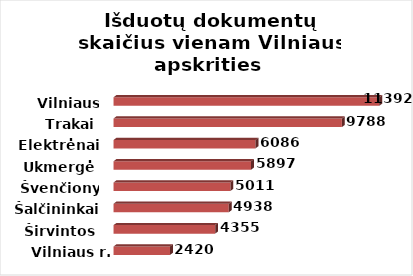
| Category | Series 0 |
|---|---|
| Vilniaus r. | 2420 |
| Širvintos | 4355 |
| Šalčininkai | 4938 |
| Švenčionys | 5011 |
| Ukmergė | 5897 |
| Elektrėnai | 6086 |
| Trakai | 9788 |
| Vilniaus m. | 11392 |